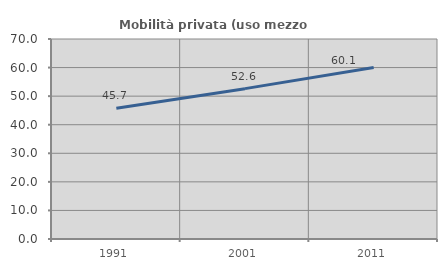
| Category | Mobilità privata (uso mezzo privato) |
|---|---|
| 1991.0 | 45.743 |
| 2001.0 | 52.624 |
| 2011.0 | 60.057 |